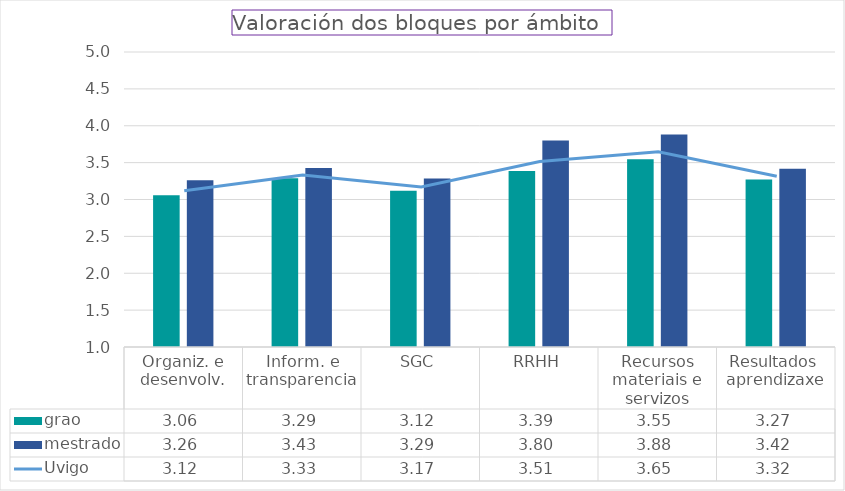
| Category | grao | mestrado |
|---|---|---|
| Organiz. e desenvolv. | 3.058 | 3.259 |
| Inform. e transparencia | 3.287 | 3.428 |
| SGC | 3.119 | 3.286 |
| RRHH | 3.388 | 3.801 |
| Recursos materiais e servizos | 3.547 | 3.881 |
| Resultados  aprendizaxe | 3.27 | 3.417 |